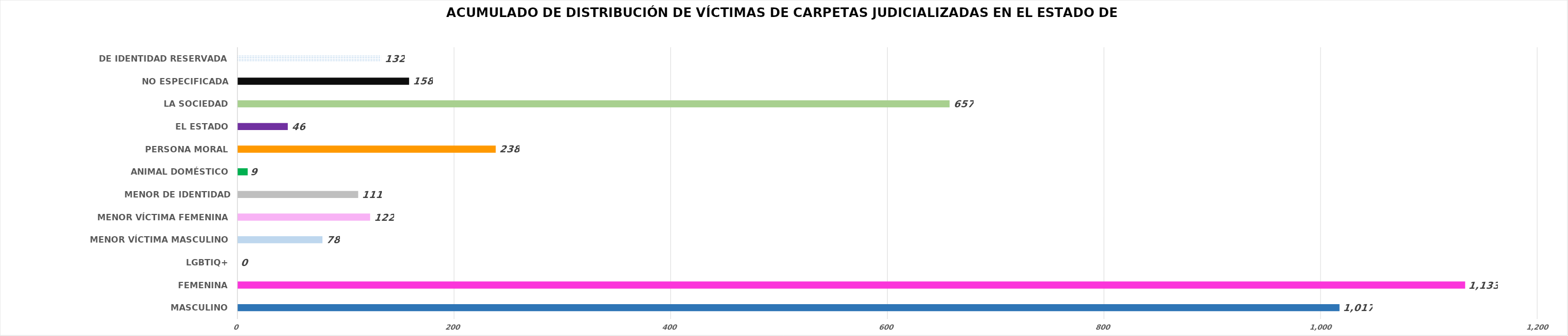
| Category | Series 0 |
|---|---|
| MASCULINO | 1017 |
| FEMENINA | 1133 |
| LGBTIQ+ | 0 |
| MENOR VÍCTIMA MASCULINO | 78 |
| MENOR VÍCTIMA FEMENINA | 122 |
| MENOR DE IDENTIDAD RESERVADA | 111 |
| ANIMAL DOMÉSTICO | 9 |
| PERSONA MORAL | 238 |
| EL ESTADO | 46 |
| LA SOCIEDAD | 657 |
| NO ESPECIFICADA | 158 |
| DE IDENTIDAD RESERVADA | 132 |